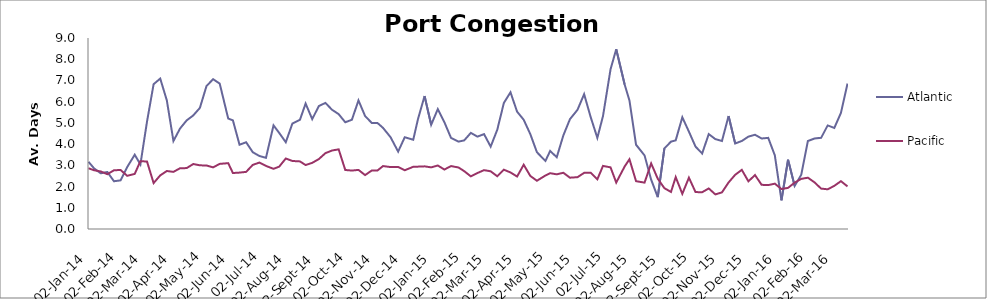
| Category | Atlantic  | Pacific |
|---|---|---|
| 2014-01-02 | 3.167 | 2.863 |
| 2014-01-08 | 2.854 | 2.767 |
| 2014-01-15 | 2.625 | 2.712 |
| 2014-01-22 | 2.688 | 2.582 |
| 2014-01-29 | 2.25 | 2.767 |
| 2014-02-05 | 2.292 | 2.781 |
| 2014-02-12 | 2.917 | 2.507 |
| 2014-02-20 | 3.5 | 2.596 |
| 2014-02-26 | 3.042 | 3.199 |
| 2014-03-05 | 5.059 | 3.178 |
| 2014-03-12 | 6.824 | 2.164 |
| 2014-03-19 | 7.088 | 2.527 |
| 2014-03-26 | 6.059 | 2.733 |
| 2014-04-02 | 4.147 | 2.692 |
| 2014-04-09 | 4.735 | 2.863 |
| 2014-04-16 | 5.118 | 2.87 |
| 2014-04-23 | 5.353 | 3.062 |
| 2014-04-30 | 5.706 | 3 |
| 2014-05-07 | 6.735 | 2.993 |
| 2014-05-14 | 7.059 | 2.904 |
| 2014-05-21 | 6.853 | 3.068 |
| 2014-05-30 | 5.206 | 3.103 |
| 2014-06-04 | 5.118 | 2.637 |
| 2014-06-11 | 3.971 | 2.658 |
| 2014-06-18 | 4.088 | 2.692 |
| 2014-06-25 | 3.618 | 3.021 |
| 2014-07-02 | 3.441 | 3.13 |
| 2014-07-09 | 3.353 | 2.973 |
| 2014-07-17 | 4.882 | 2.836 |
| 2014-07-23 | 4.529 | 2.938 |
| 2014-07-30 | 4.088 | 3.322 |
| 2014-08-06 | 4.971 | 3.205 |
| 2014-08-14 | 5.147 | 3.185 |
| 2014-08-20 | 5.912 | 3.014 |
| 2014-08-27 | 5.176 | 3.116 |
| 2014-09-03 | 5.794 | 3.295 |
| 2014-09-10 | 5.941 | 3.575 |
| 2014-09-17 | 5.618 | 3.699 |
| 2014-09-24 | 5.412 | 3.753 |
| 2014-10-01 | 5.029 | 2.781 |
| 2014-10-08 | 5.147 | 2.753 |
| 2014-10-15 | 6.059 | 2.785 |
| 2014-10-22 | 5.324 | 2.541 |
| 2014-10-29 | 5 | 2.753 |
| 2014-11-04 | 5 | 2.753 |
| 2014-11-10 | 4.765 | 2.966 |
| 2014-11-18 | 4.324 | 2.918 |
| 2014-11-26 | 3.647 | 2.925 |
| 2014-12-03 | 4.324 | 2.767 |
| 2014-12-12 | 4.206 | 2.932 |
| 2014-12-17 | 5.176 | 2.938 |
| 2014-12-24 | 6.265 | 2.952 |
| 2014-12-31 | 4.912 | 2.904 |
| 2015-01-07 | 5.647 | 2.993 |
| 2015-01-14 | 5.029 | 2.801 |
| 2015-01-21 | 4.294 | 2.966 |
| 2015-01-29 | 4.118 | 2.897 |
| 2015-02-04 | 4.176 | 2.726 |
| 2015-02-11 | 4.529 | 2.479 |
| 2015-02-18 | 4.353 | 2.637 |
| 2015-02-25 | 4.471 | 2.774 |
| 2015-03-04 | 3.882 | 2.719 |
| 2015-03-11 | 4.676 | 2.486 |
| 2015-03-18 | 5.941 | 2.795 |
| 2015-03-25 | 6.441 | 2.664 |
| 2015-04-01 | 5.529 | 2.473 |
| 2015-04-08 | 5.147 | 3.027 |
| 2015-04-15 | 4.471 | 2.5 |
| 2015-04-22 | 3.618 | 2.274 |
| 2015-05-01 | 3.206 | 2.521 |
| 2015-05-06 | 3.676 | 2.63 |
| 2015-05-13 | 3.382 | 2.575 |
| 2015-05-20 | 4.412 | 2.651 |
| 2015-05-27 | 5.176 | 2.418 |
| 2015-06-04 | 5.618 | 2.442 |
| 2015-06-11 | 6.353 | 2.645 |
| 2015-06-18 | 5.265 | 2.651 |
| 2015-06-25 | 4.294 | 2.342 |
| 2015-07-01 | 5.324 | 2.973 |
| 2015-07-09 | 7.529 | 2.904 |
| 2015-07-15 | 8.471 | 2.189 |
| 2015-07-24 | 6.794 | 2.952 |
| 2015-07-29 | 6.059 | 3.288 |
| 2015-08-05 | 3.971 | 2.253 |
| 2015-08-14 | 3.471 | 2.185 |
| 2015-08-21 | 2.324 | 3.089 |
| 2015-08-28 | 1.5 | 2.37 |
| 2015-09-04 | 3.794 | 1.925 |
| 2015-09-11 | 4.118 | 1.747 |
| 2015-09-16 | 4.176 | 2.445 |
| 2015-09-23 | 5.265 | 1.658 |
| 2015-09-30 | 4.588 | 2.418 |
| 2015-10-07 | 3.882 | 1.74 |
| 2015-10-14 | 3.559 | 1.733 |
| 2015-10-21 | 4.471 | 1.911 |
| 2015-10-28 | 4.235 | 1.63 |
| 2015-11-04 | 4.147 | 1.726 |
| 2015-11-11 | 5.324 | 2.192 |
| 2015-11-18 | 4.029 | 2.555 |
| 2015-11-25 | 4.147 | 2.788 |
| 2015-12-02 | 4.353 | 2.247 |
| 2015-12-09 | 4.441 | 2.541 |
| 2015-12-16 | 4.265 | 2.082 |
| 2015-12-23 | 4.294 | 2.068 |
| 2015-12-30 | 3.471 | 2.137 |
| 2016-01-06 | 1.353 | 1.884 |
| 2016-01-13 | 3.265 | 1.938 |
| 2016-01-20 | 2.029 | 2.185 |
| 2016-01-27 | 2.559 | 2.363 |
| 2016-02-03 | 4.147 | 2.418 |
| 2016-02-10 | 4.265 | 2.199 |
| 2016-02-17 | 4.294 | 1.904 |
| 2016-02-24 | 4.882 | 1.87 |
| 2016-03-02 | 4.765 | 2.034 |
| 2016-03-09 | 5.471 | 2.253 |
| 2016-03-16 | 6.853 | 2.007 |